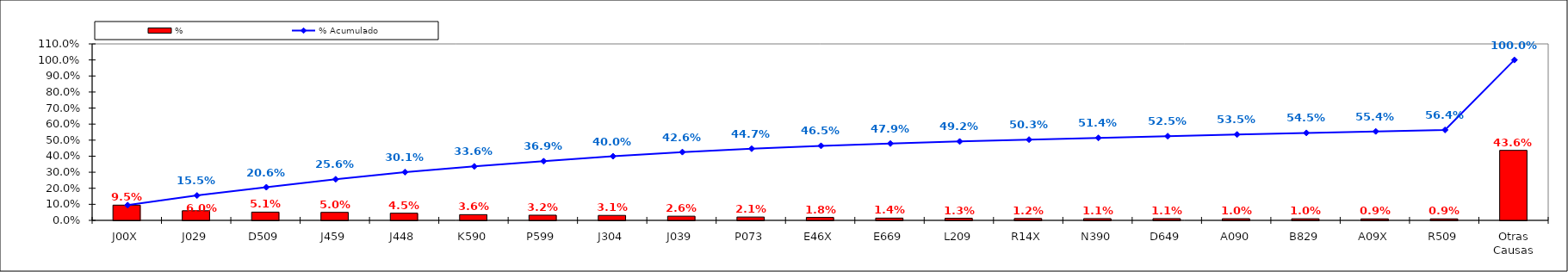
| Category | % |
|---|---|
| J00X | 0.095 |
| J029 | 0.06 |
| D509 | 0.051 |
| J459 | 0.05 |
| J448 | 0.045 |
| K590 | 0.036 |
| P599 | 0.032 |
| J304 | 0.031 |
| J039 | 0.026 |
| P073 | 0.021 |
| E46X | 0.018 |
| E669 | 0.014 |
| L209 | 0.013 |
| R14X | 0.012 |
| N390 | 0.011 |
| D649 | 0.011 |
| A090 | 0.01 |
| B829 | 0.01 |
| A09X | 0.009 |
| R509 | 0.009 |
| Otras Causas | 0.436 |